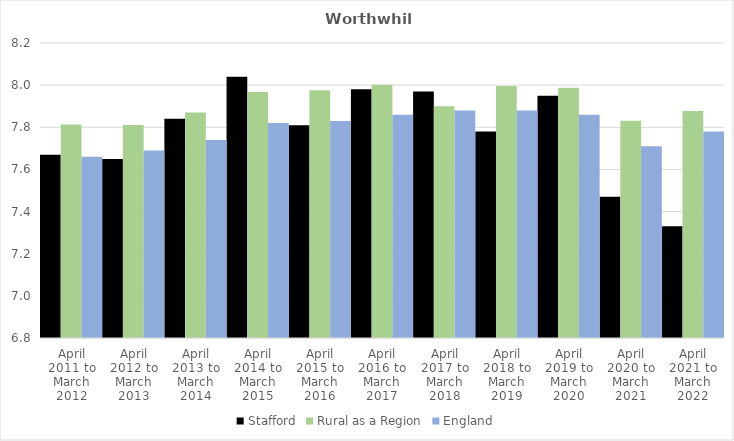
| Category | Stafford | Rural as a Region | England |
|---|---|---|---|
| April 2011 to March 2012 | 7.67 | 7.813 | 7.66 |
| April 2012 to March 2013 | 7.65 | 7.811 | 7.69 |
| April 2013 to March 2014 | 7.84 | 7.871 | 7.74 |
| April 2014 to March 2015 | 8.04 | 7.967 | 7.82 |
| April 2015 to March 2016 | 7.81 | 7.975 | 7.83 |
| April 2016 to March 2017 | 7.98 | 8.002 | 7.86 |
| April 2017 to March 2018 | 7.97 | 7.9 | 7.88 |
| April 2018 to March 2019 | 7.78 | 7.996 | 7.88 |
| April 2019 to March 2020 | 7.95 | 7.988 | 7.86 |
| April 2020 to March 2021 | 7.47 | 7.831 | 7.71 |
| April 2021 to March 2022 | 7.33 | 7.877 | 7.78 |